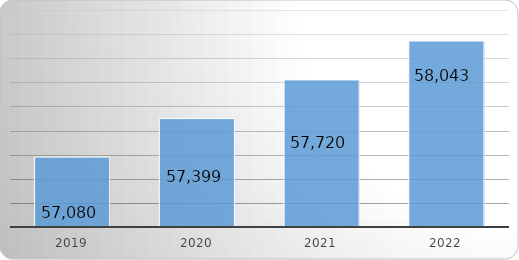
| Category | Series 0 |
|---|---|
| 2019.0 | 57080.017 |
| 2020.0 | 57399.258 |
| 2021.0 | 57720.285 |
| 2022.0 | 58043.107 |